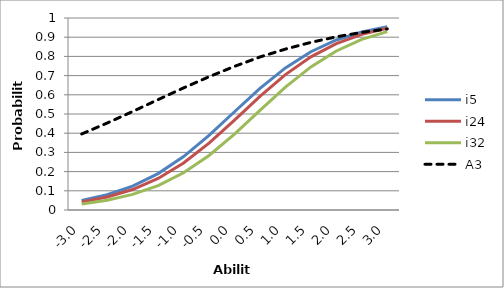
| Category | i5 | i24 | i32 | A3 |
|---|---|---|---|---|
| -3.0 | 0.05 | 0.042 | 0.031 | 0.396 |
| -2.5 | 0.079 | 0.067 | 0.051 | 0.453 |
| -2.0 | 0.124 | 0.107 | 0.081 | 0.513 |
| -1.5 | 0.19 | 0.164 | 0.127 | 0.575 |
| -1.0 | 0.278 | 0.245 | 0.194 | 0.636 |
| -0.5 | 0.389 | 0.348 | 0.284 | 0.694 |
| 0.0 | 0.512 | 0.468 | 0.395 | 0.748 |
| 0.5 | 0.633 | 0.592 | 0.518 | 0.797 |
| 1.0 | 0.74 | 0.705 | 0.64 | 0.838 |
| 1.5 | 0.824 | 0.798 | 0.745 | 0.873 |
| 2.0 | 0.886 | 0.867 | 0.828 | 0.902 |
| 2.5 | 0.927 | 0.915 | 0.888 | 0.925 |
| 3.0 | 0.955 | 0.946 | 0.929 | 0.943 |